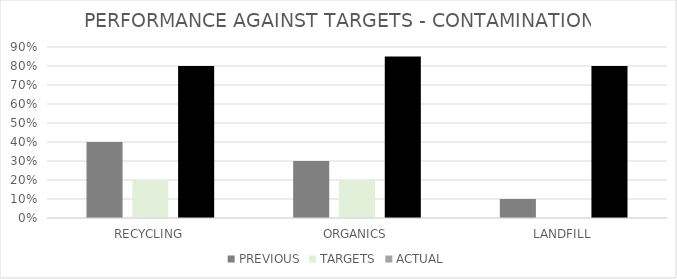
| Category | PREVIOUS | TARGETS | ACTUAL |
|---|---|---|---|
| RECYCLING | 0.4 | 0.2 | 0.8 |
| ORGANICS | 0.3 | 0.2 | 0.85 |
| LANDFILL | 0.1 | 0 | 0.8 |